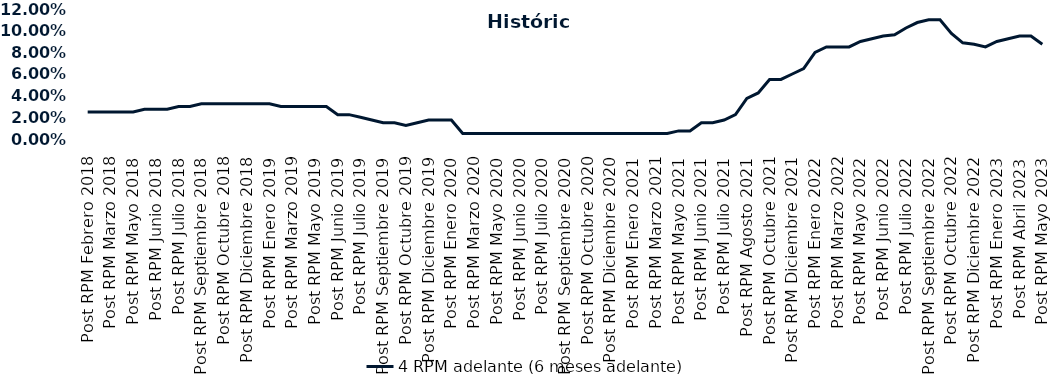
| Category | 4 RPM adelante (6 meses adelante) |
|---|---|
| Post RPM Febrero 2018 | 0.025 |
| Pre RPM Marzo 2018 | 0.025 |
| Post RPM Marzo 2018 | 0.025 |
| Pre RPM Mayo 2018 | 0.025 |
| Post RPM Mayo 2018 | 0.025 |
| Pre RPM Junio 2018 | 0.028 |
| Post RPM Junio 2018 | 0.028 |
| Pre RPM Julio 2018 | 0.028 |
| Post RPM Julio 2018 | 0.03 |
| Pre RPM Septiembre 2018 | 0.03 |
| Post RPM Septiembre 2018 | 0.032 |
| Pre RPM Octubre 2018 | 0.032 |
| Post RPM Octubre 2018 | 0.032 |
| Pre RPM Diciembre 2018 | 0.032 |
| Post RPM Diciembre 2018 | 0.032 |
| Pre RPM Enero 2019 | 0.032 |
| Post RPM Enero 2019 | 0.032 |
| Pre RPM Marzo 2019 | 0.03 |
| Post RPM Marzo 2019 | 0.03 |
| Pre RPM Mayo 2019 | 0.03 |
| Post RPM Mayo 2019 | 0.03 |
| Pre RPM Junio 2019 | 0.03 |
| Post RPM Junio 2019 | 0.022 |
| Pre RPM Julio 2019 | 0.022 |
| Post RPM Julio 2019 | 0.02 |
| Pre RPM Septiembre 2019 | 0.018 |
| Post RPM Septiembre 2019 | 0.015 |
| Pre RPM Octubre 2019 | 0.015 |
| Post RPM Octubre 2019 | 0.012 |
| Pre RPM Diciembre 2019 | 0.015 |
| Post RPM Diciembre 2019 | 0.018 |
| Pre RPM Enero 2020 | 0.018 |
| Post RPM Enero 2020 | 0.018 |
| Pre RPM Marzo 2020 | 0.005 |
| Post RPM Marzo 2020 | 0.005 |
| Pre RPM Mayo 2020 | 0.005 |
| Post RPM Mayo 2020 | 0.005 |
| Pre RPM Junio 2020 | 0.005 |
| Post RPM Junio 2020 | 0.005 |
| Pre RPM Julio 2020 | 0.005 |
| Post RPM Julio 2020 | 0.005 |
| Pre RPM Septiembre 2020 | 0.005 |
| Post RPM Septiembre 2020 | 0.005 |
| Pre RPM Octubre 2020 | 0.005 |
| Post RPM Octubre 2020 | 0.005 |
| Pre RPM Diciembre 2020 | 0.005 |
| Post RPM Diciembre 2020 | 0.005 |
| Pre RPM Enero 2021 | 0.005 |
| Post RPM Enero 2021 | 0.005 |
| Pre RPM Marzo 2021 | 0.005 |
| Post RPM Marzo 2021 | 0.005 |
| Pre RPM Mayo 2021 | 0.005 |
| Post RPM Mayo 2021 | 0.008 |
| Pre RPM Junio 2021 | 0.008 |
| Post RPM Junio 2021 | 0.015 |
| Pre RPM Julio 2021 | 0.015 |
| Post RPM Julio 2021 | 0.018 |
| Pre RPM Agosto 2021 | 0.022 |
| Post RPM Agosto 2021 | 0.038 |
| Pre RPM Octubre 2021 | 0.042 |
| Post RPM Octubre 2021 | 0.055 |
| Pre RPM Diciembre 2021 | 0.055 |
| Post RPM Diciembre 2021 | 0.06 |
| Pre RPM Enero 2022 | 0.065 |
| Post RPM Enero 2022 | 0.08 |
| Pre RPM Marzo 2022 | 0.085 |
| Post RPM Marzo 2022 | 0.085 |
| Pre RPM Mayo 2022 | 0.085 |
| Post RPM Mayo 2022 | 0.09 |
| Pre RPM Junio 2022 | 0.092 |
| Post RPM Junio 2022 | 0.095 |
| Pre RPM Julio 2022 | 0.096 |
| Post RPM Julio 2022 | 0.102 |
| Pre RPM Septiembre 2022 | 0.108 |
| Post RPM Septiembre 2022 | 0.11 |
| Pre RPM Octubre 2022 | 0.11 |
| Post RPM Octubre 2022 | 0.098 |
| Pre RPM Diciembre 2022 | 0.089 |
| Post RPM Diciembre 2022 | 0.088 |
| Pre RPM Enero 2023 | 0.085 |
| Post RPM Enero 2023 | 0.09 |
| Pre RPM Abril 2023 | 0.092 |
| Post RPM Abril 2023 | 0.095 |
| Pre RPM Mayo 2023 | 0.095 |
| Post RPM Mayo 2023 | 0.088 |